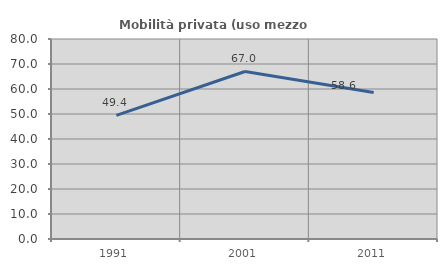
| Category | Mobilità privata (uso mezzo privato) |
|---|---|
| 1991.0 | 49.444 |
| 2001.0 | 67.01 |
| 2011.0 | 58.571 |